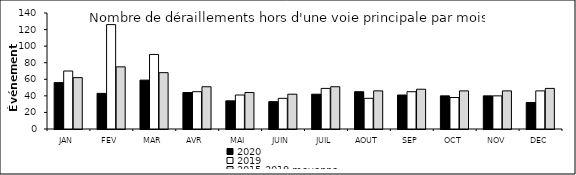
| Category | 2020 | 2019 | 2015-2019 moyenne |
|---|---|---|---|
| JAN | 56 | 70 | 62 |
| FEV | 43 | 126 | 75 |
| MAR | 59 | 90 | 68 |
| AVR | 44 | 45 | 51 |
| MAI | 34 | 41 | 44 |
| JUIN | 33 | 37 | 42 |
| JUIL | 42 | 49 | 51 |
| AOUT | 45 | 37 | 46 |
| SEP | 41 | 45 | 48 |
| OCT | 40 | 38 | 46 |
| NOV | 40 | 40 | 46 |
| DEC | 32 | 46 | 49 |